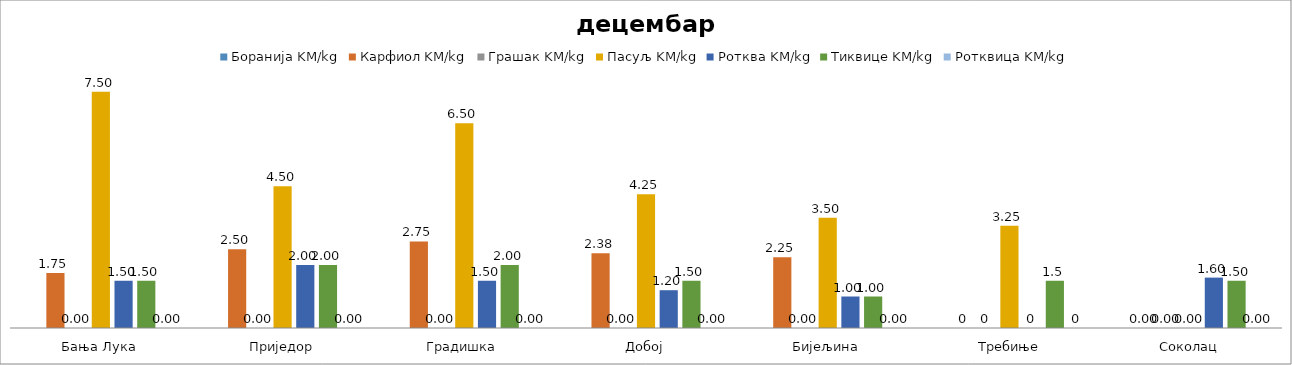
| Category | Боранија KM/kg | Карфиол KM/kg | Грашак KM/kg | Пасуљ KM/kg | Ротква KM/kg | Тиквице KM/kg | Ротквица KM/kg |
|---|---|---|---|---|---|---|---|
| Бања Лука |  | 1.75 | 0 | 7.5 | 1.5 | 1.5 | 0 |
| Приједор |  | 2.5 | 0 | 4.5 | 2 | 2 | 0 |
| Градишка |  | 2.75 | 0 | 6.5 | 1.5 | 2 | 0 |
| Добој |  | 2.375 | 0 | 4.25 | 1.2 | 1.5 | 0 |
| Бијељина |  | 2.25 | 0 | 3.5 | 1 | 1 | 0 |
|  Требиње |  | 0 | 0 | 3.25 | 0 | 1.5 | 0 |
| Соколац |  | 0 | 0 | 0 | 1.6 | 1.5 | 0 |